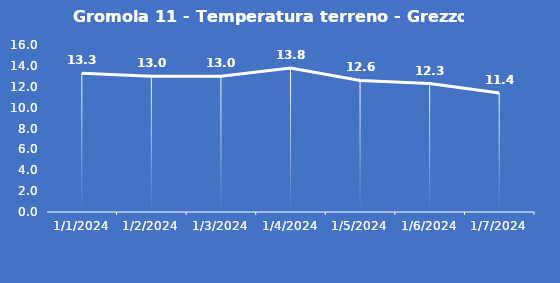
| Category | Gromola 11 - Temperatura terreno - Grezzo (°C) |
|---|---|
| 1/1/24 | 13.3 |
| 1/2/24 | 13 |
| 1/3/24 | 13 |
| 1/4/24 | 13.8 |
| 1/5/24 | 12.6 |
| 1/6/24 | 12.3 |
| 1/7/24 | 11.4 |